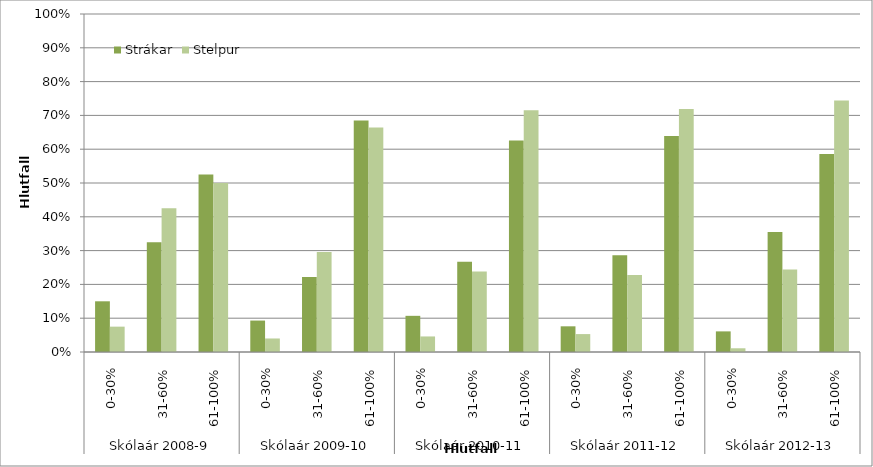
| Category | Strákar | Stelpur |
|---|---|---|
| 0 | 0.15 | 0.075 |
| 1 | 0.325 | 0.425 |
| 2 | 0.525 | 0.5 |
| 3 | 0.093 | 0.04 |
| 4 | 0.222 | 0.296 |
| 5 | 0.685 | 0.664 |
| 6 | 0.107 | 0.046 |
| 7 | 0.267 | 0.238 |
| 8 | 0.626 | 0.715 |
| 9 | 0.076 | 0.053 |
| 10 | 0.286 | 0.228 |
| 11 | 0.639 | 0.719 |
| 12 | 0.061 | 0.011 |
| 13 | 0.355 | 0.244 |
| 14 | 0.586 | 0.744 |